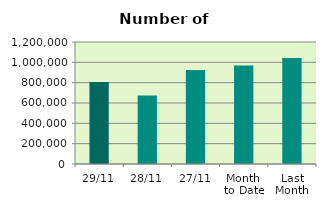
| Category | Series 0 |
|---|---|
| 29/11 | 807754 |
| 28/11 | 674844 |
| 27/11 | 925710 |
| Month 
to Date | 969317.238 |
| Last
Month | 1042648 |